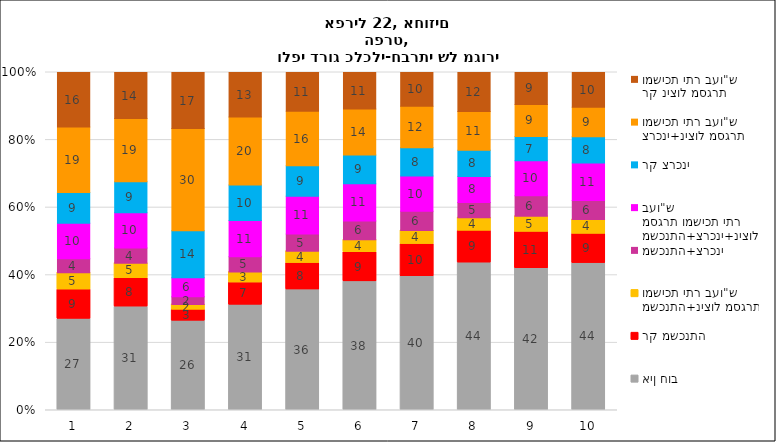
| Category | אין חוב | רק משכנתה | משכנתה+ניצול מסגרת ומשיכת יתר בעו"ש | משכנתה+צרכני | משכנתה+צרכני+ניצול מסגרת ומשיכת יתר בעו"ש | רק צרכני | צרכני+ניצול מסגרת ומשיכת יתר בעו"ש | רק ניצול מסגרת ומשיכת יתר בעו"ש |
|---|---|---|---|---|---|---|---|---|
| 1.0 | 27.045 | 8.672 | 5.072 | 4.142 | 10.499 | 9.035 | 19.438 | 16.097 |
| 2.0 | 30.671 | 8.419 | 4.511 | 4.478 | 10.464 | 9.143 | 18.67 | 13.645 |
| 3.0 | 26.493 | 3.244 | 1.643 | 2.259 | 5.608 | 13.921 | 30.246 | 16.586 |
| 4.0 | 31.216 | 6.577 | 3.197 | 4.525 | 10.706 | 10.458 | 20.17 | 13.15 |
| 5.0 | 35.74 | 7.817 | 3.574 | 5.054 | 11.171 | 9.021 | 16.14 | 11.483 |
| 6.0 | 38.132 | 8.612 | 3.779 | 5.507 | 11.041 | 8.546 | 13.568 | 10.815 |
| 7.0 | 39.649 | 9.538 | 4.066 | 5.663 | 10.434 | 8.374 | 12.278 | 9.998 |
| 8.0 | 43.684 | 9.417 | 3.953 | 4.517 | 7.636 | 7.819 | 11.453 | 11.521 |
| 9.0 | 42.048 | 10.726 | 4.71 | 6.051 | 10.325 | 7.217 | 9.469 | 9.455 |
| 10.0 | 43.537 | 8.658 | 4.327 | 5.62 | 11.065 | 7.796 | 8.701 | 10.297 |